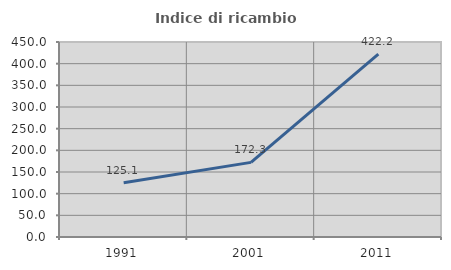
| Category | Indice di ricambio occupazionale  |
|---|---|
| 1991.0 | 125.059 |
| 2001.0 | 172.252 |
| 2011.0 | 422.191 |